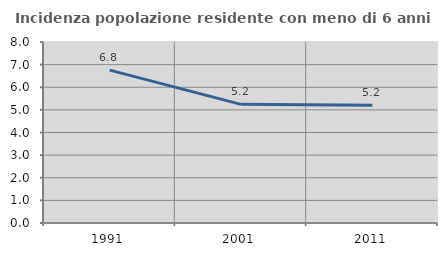
| Category | Incidenza popolazione residente con meno di 6 anni |
|---|---|
| 1991.0 | 6.757 |
| 2001.0 | 5.244 |
| 2011.0 | 5.206 |